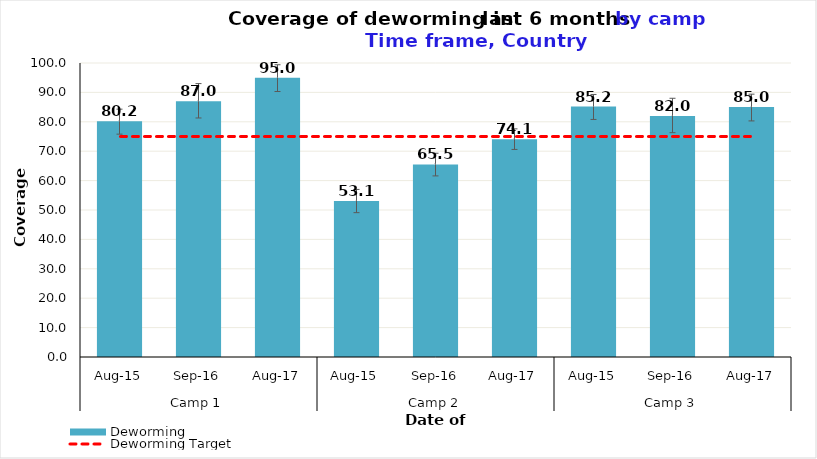
| Category | Deworming |
|---|---|
| 0 | 80.2 |
| 1 | 87 |
| 2 | 95 |
| 3 | 53.1 |
| 4 | 65.5 |
| 5 | 74.1 |
| 6 | 85.2 |
| 7 | 82 |
| 8 | 85 |